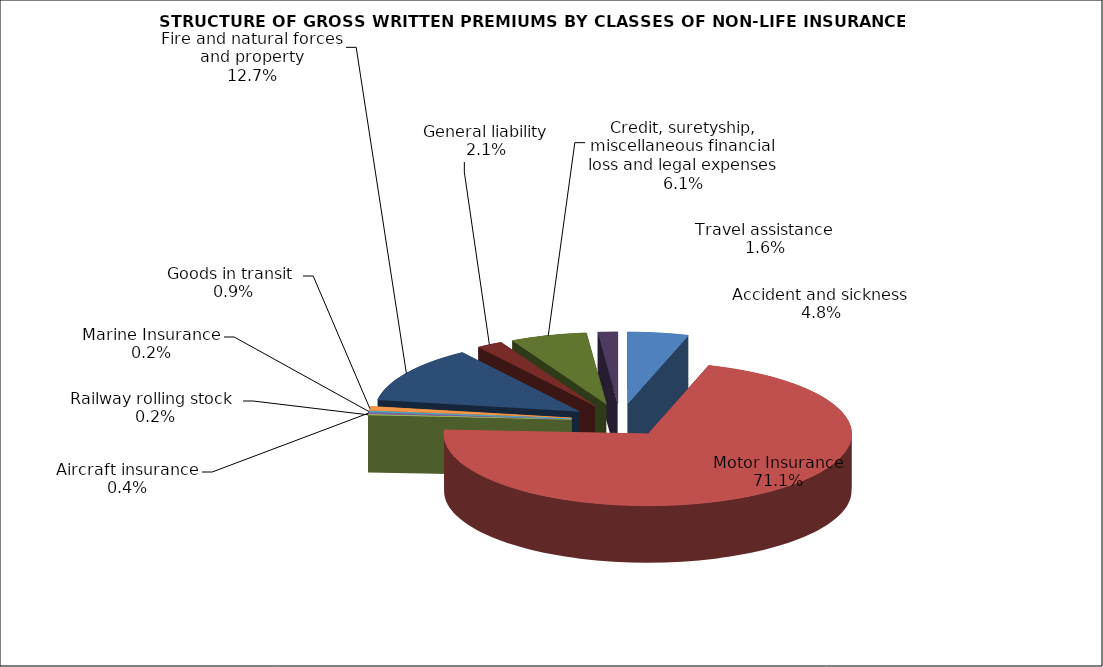
| Category | Accident and sickness |
|---|---|
| Accident and sickness | 0.048 |
| Motor Insurance | 0.711 |
| Railway rolling stock  | 0.002 |
| Aircraft insurance | 0.004 |
| Marine Insurance | 0.002 |
| Goods in transit  | 0.009 |
| Fire and natural forces and property | 0.127 |
| General liability | 0.021 |
| Credit, suretyship, miscellaneous financial loss and legal expenses | 0.061 |
| Travel assistance | 0.016 |